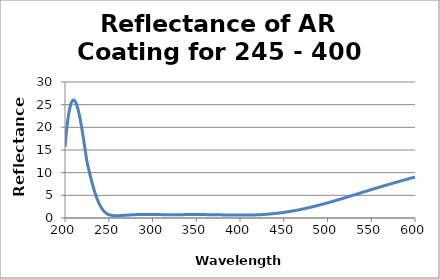
| Category | Reflectance (%) |
|---|---|
| 200.0 | 15.685 |
| 201.0 | 17.803 |
| 202.0 | 19.676 |
| 203.0 | 21.294 |
| 204.0 | 22.658 |
| 205.0 | 23.773 |
| 206.0 | 24.65 |
| 207.0 | 25.302 |
| 208.0 | 25.74 |
| 209.0 | 25.976 |
| 210.0 | 26.025 |
| 211.0 | 25.897 |
| 212.0 | 25.606 |
| 213.0 | 25.162 |
| 214.0 | 24.579 |
| 215.0 | 23.866 |
| 216.0 | 23.038 |
| 217.0 | 22.105 |
| 218.0 | 21.08 |
| 219.0 | 19.978 |
| 220.0 | 18.811 |
| 221.0 | 17.594 |
| 222.0 | 16.341 |
| 223.0 | 15.067 |
| 224.0 | 13.788 |
| 225.0 | 12.519 |
| 226.0 | 11.651 |
| 227.0 | 10.812 |
| 228.0 | 9.994 |
| 229.0 | 9.201 |
| 230.0 | 8.436 |
| 231.0 | 7.704 |
| 232.0 | 7.005 |
| 233.0 | 6.342 |
| 234.0 | 5.717 |
| 235.0 | 5.132 |
| 236.0 | 4.586 |
| 237.0 | 4.081 |
| 238.0 | 3.616 |
| 239.0 | 3.19 |
| 240.0 | 2.804 |
| 241.0 | 2.455 |
| 242.0 | 2.143 |
| 243.0 | 1.865 |
| 244.0 | 1.621 |
| 245.0 | 1.407 |
| 246.0 | 1.223 |
| 247.0 | 1.066 |
| 248.0 | 0.934 |
| 249.0 | 0.826 |
| 250.0 | 0.737 |
| 251.0 | 0.681 |
| 252.0 | 0.634 |
| 253.0 | 0.596 |
| 254.0 | 0.565 |
| 255.0 | 0.542 |
| 256.0 | 0.524 |
| 257.0 | 0.513 |
| 258.0 | 0.506 |
| 259.0 | 0.504 |
| 260.0 | 0.505 |
| 261.0 | 0.509 |
| 262.0 | 0.516 |
| 263.0 | 0.525 |
| 264.0 | 0.536 |
| 265.0 | 0.548 |
| 266.0 | 0.561 |
| 267.0 | 0.575 |
| 268.0 | 0.589 |
| 269.0 | 0.604 |
| 270.0 | 0.618 |
| 271.0 | 0.632 |
| 272.0 | 0.646 |
| 273.0 | 0.66 |
| 274.0 | 0.673 |
| 275.0 | 0.685 |
| 276.0 | 0.697 |
| 277.0 | 0.708 |
| 278.0 | 0.718 |
| 279.0 | 0.727 |
| 280.0 | 0.736 |
| 281.0 | 0.743 |
| 282.0 | 0.75 |
| 283.0 | 0.756 |
| 284.0 | 0.762 |
| 285.0 | 0.766 |
| 286.0 | 0.77 |
| 287.0 | 0.773 |
| 288.0 | 0.775 |
| 289.0 | 0.777 |
| 290.0 | 0.778 |
| 291.0 | 0.779 |
| 292.0 | 0.779 |
| 293.0 | 0.779 |
| 294.0 | 0.778 |
| 295.0 | 0.777 |
| 296.0 | 0.776 |
| 297.0 | 0.774 |
| 298.0 | 0.772 |
| 299.0 | 0.77 |
| 300.0 | 0.768 |
| 301.0 | 0.765 |
| 302.0 | 0.763 |
| 303.0 | 0.76 |
| 304.0 | 0.758 |
| 305.0 | 0.756 |
| 306.0 | 0.753 |
| 307.0 | 0.751 |
| 308.0 | 0.749 |
| 309.0 | 0.746 |
| 310.0 | 0.744 |
| 311.0 | 0.743 |
| 312.0 | 0.741 |
| 313.0 | 0.739 |
| 314.0 | 0.738 |
| 315.0 | 0.736 |
| 316.0 | 0.735 |
| 317.0 | 0.734 |
| 318.0 | 0.734 |
| 319.0 | 0.733 |
| 320.0 | 0.733 |
| 321.0 | 0.732 |
| 322.0 | 0.732 |
| 323.0 | 0.732 |
| 324.0 | 0.733 |
| 325.0 | 0.733 |
| 326.0 | 0.734 |
| 327.0 | 0.734 |
| 328.0 | 0.735 |
| 329.0 | 0.736 |
| 330.0 | 0.737 |
| 331.0 | 0.738 |
| 332.0 | 0.739 |
| 333.0 | 0.74 |
| 334.0 | 0.742 |
| 335.0 | 0.743 |
| 336.0 | 0.744 |
| 337.0 | 0.745 |
| 338.0 | 0.747 |
| 339.0 | 0.748 |
| 340.0 | 0.749 |
| 341.0 | 0.75 |
| 342.0 | 0.751 |
| 343.0 | 0.752 |
| 344.0 | 0.753 |
| 345.0 | 0.754 |
| 346.0 | 0.755 |
| 347.0 | 0.756 |
| 348.0 | 0.756 |
| 349.0 | 0.756 |
| 350.0 | 0.757 |
| 351.0 | 0.757 |
| 352.0 | 0.756 |
| 353.0 | 0.756 |
| 354.0 | 0.755 |
| 355.0 | 0.754 |
| 356.0 | 0.754 |
| 357.0 | 0.752 |
| 358.0 | 0.751 |
| 359.0 | 0.75 |
| 360.0 | 0.748 |
| 361.0 | 0.746 |
| 362.0 | 0.744 |
| 363.0 | 0.742 |
| 364.0 | 0.74 |
| 365.0 | 0.737 |
| 366.0 | 0.734 |
| 367.0 | 0.732 |
| 368.0 | 0.729 |
| 369.0 | 0.726 |
| 370.0 | 0.723 |
| 371.0 | 0.719 |
| 372.0 | 0.716 |
| 373.0 | 0.713 |
| 374.0 | 0.709 |
| 375.0 | 0.706 |
| 376.0 | 0.702 |
| 377.0 | 0.698 |
| 378.0 | 0.695 |
| 379.0 | 0.691 |
| 380.0 | 0.687 |
| 381.0 | 0.684 |
| 382.0 | 0.68 |
| 383.0 | 0.676 |
| 384.0 | 0.673 |
| 385.0 | 0.669 |
| 386.0 | 0.666 |
| 387.0 | 0.663 |
| 388.0 | 0.66 |
| 389.0 | 0.656 |
| 390.0 | 0.654 |
| 391.0 | 0.651 |
| 392.0 | 0.648 |
| 393.0 | 0.646 |
| 394.0 | 0.644 |
| 395.0 | 0.642 |
| 396.0 | 0.64 |
| 397.0 | 0.638 |
| 398.0 | 0.637 |
| 399.0 | 0.636 |
| 400.0 | 0.636 |
| 401.0 | 0.635 |
| 402.0 | 0.635 |
| 403.0 | 0.636 |
| 404.0 | 0.636 |
| 405.0 | 0.637 |
| 406.0 | 0.639 |
| 407.0 | 0.64 |
| 408.0 | 0.643 |
| 409.0 | 0.645 |
| 410.0 | 0.648 |
| 411.0 | 0.652 |
| 412.0 | 0.656 |
| 413.0 | 0.66 |
| 414.0 | 0.665 |
| 415.0 | 0.67 |
| 416.0 | 0.676 |
| 417.0 | 0.682 |
| 418.0 | 0.689 |
| 419.0 | 0.696 |
| 420.0 | 0.704 |
| 421.0 | 0.713 |
| 422.0 | 0.722 |
| 423.0 | 0.731 |
| 424.0 | 0.742 |
| 425.0 | 0.752 |
| 426.0 | 0.764 |
| 427.0 | 0.776 |
| 428.0 | 0.788 |
| 429.0 | 0.801 |
| 430.0 | 0.815 |
| 431.0 | 0.829 |
| 432.0 | 0.844 |
| 433.0 | 0.86 |
| 434.0 | 0.876 |
| 435.0 | 0.893 |
| 436.0 | 0.911 |
| 437.0 | 0.929 |
| 438.0 | 0.948 |
| 439.0 | 0.968 |
| 440.0 | 0.989 |
| 441.0 | 1.01 |
| 442.0 | 1.032 |
| 443.0 | 1.055 |
| 444.0 | 1.078 |
| 445.0 | 1.102 |
| 446.0 | 1.127 |
| 447.0 | 1.152 |
| 448.0 | 1.178 |
| 449.0 | 1.205 |
| 450.0 | 1.232 |
| 451.0 | 1.26 |
| 452.0 | 1.289 |
| 453.0 | 1.318 |
| 454.0 | 1.348 |
| 455.0 | 1.379 |
| 456.0 | 1.41 |
| 457.0 | 1.442 |
| 458.0 | 1.474 |
| 459.0 | 1.508 |
| 460.0 | 1.541 |
| 461.0 | 1.575 |
| 462.0 | 1.61 |
| 463.0 | 1.646 |
| 464.0 | 1.682 |
| 465.0 | 1.719 |
| 466.0 | 1.756 |
| 467.0 | 1.794 |
| 468.0 | 1.832 |
| 469.0 | 1.872 |
| 470.0 | 1.911 |
| 471.0 | 1.952 |
| 472.0 | 1.992 |
| 473.0 | 2.034 |
| 474.0 | 2.076 |
| 475.0 | 2.118 |
| 476.0 | 2.162 |
| 477.0 | 2.205 |
| 478.0 | 2.249 |
| 479.0 | 2.294 |
| 480.0 | 2.339 |
| 481.0 | 2.385 |
| 482.0 | 2.431 |
| 483.0 | 2.478 |
| 484.0 | 2.525 |
| 485.0 | 2.572 |
| 486.0 | 2.62 |
| 487.0 | 2.669 |
| 488.0 | 2.718 |
| 489.0 | 2.767 |
| 490.0 | 2.817 |
| 491.0 | 2.867 |
| 492.0 | 2.918 |
| 493.0 | 2.969 |
| 494.0 | 3.02 |
| 495.0 | 3.072 |
| 496.0 | 3.124 |
| 497.0 | 3.177 |
| 498.0 | 3.23 |
| 499.0 | 3.283 |
| 500.0 | 3.337 |
| 501.0 | 3.391 |
| 502.0 | 3.445 |
| 503.0 | 3.5 |
| 504.0 | 3.555 |
| 505.0 | 3.61 |
| 506.0 | 3.665 |
| 507.0 | 3.721 |
| 508.0 | 3.777 |
| 509.0 | 3.833 |
| 510.0 | 3.89 |
| 511.0 | 3.946 |
| 512.0 | 4.003 |
| 513.0 | 4.06 |
| 514.0 | 4.118 |
| 515.0 | 4.176 |
| 516.0 | 4.233 |
| 517.0 | 4.291 |
| 518.0 | 4.349 |
| 519.0 | 4.408 |
| 520.0 | 4.466 |
| 521.0 | 4.525 |
| 522.0 | 4.584 |
| 523.0 | 4.642 |
| 524.0 | 4.702 |
| 525.0 | 4.761 |
| 526.0 | 4.82 |
| 527.0 | 4.879 |
| 528.0 | 4.939 |
| 529.0 | 4.998 |
| 530.0 | 5.058 |
| 531.0 | 5.118 |
| 532.0 | 5.177 |
| 533.0 | 5.238 |
| 534.0 | 5.298 |
| 535.0 | 5.358 |
| 536.0 | 5.418 |
| 537.0 | 5.478 |
| 538.0 | 5.539 |
| 539.0 | 5.599 |
| 540.0 | 5.659 |
| 541.0 | 5.719 |
| 542.0 | 5.78 |
| 543.0 | 5.84 |
| 544.0 | 5.9 |
| 545.0 | 5.96 |
| 546.0 | 6.02 |
| 547.0 | 6.08 |
| 548.0 | 6.14 |
| 549.0 | 6.2 |
| 550.0 | 6.26 |
| 551.0 | 6.318 |
| 552.0 | 6.376 |
| 553.0 | 6.434 |
| 554.0 | 6.492 |
| 555.0 | 6.55 |
| 556.0 | 6.608 |
| 557.0 | 6.665 |
| 558.0 | 6.723 |
| 559.0 | 6.781 |
| 560.0 | 6.838 |
| 561.0 | 6.896 |
| 562.0 | 6.953 |
| 563.0 | 7.01 |
| 564.0 | 7.067 |
| 565.0 | 7.124 |
| 566.0 | 7.181 |
| 567.0 | 7.238 |
| 568.0 | 7.295 |
| 569.0 | 7.351 |
| 570.0 | 7.408 |
| 571.0 | 7.464 |
| 572.0 | 7.52 |
| 573.0 | 7.576 |
| 574.0 | 7.632 |
| 575.0 | 7.688 |
| 576.0 | 7.743 |
| 577.0 | 7.799 |
| 578.0 | 7.854 |
| 579.0 | 7.909 |
| 580.0 | 7.964 |
| 581.0 | 8.019 |
| 582.0 | 8.074 |
| 583.0 | 8.128 |
| 584.0 | 8.182 |
| 585.0 | 8.237 |
| 586.0 | 8.291 |
| 587.0 | 8.344 |
| 588.0 | 8.398 |
| 589.0 | 8.451 |
| 590.0 | 8.505 |
| 591.0 | 8.558 |
| 592.0 | 8.61 |
| 593.0 | 8.663 |
| 594.0 | 8.716 |
| 595.0 | 8.768 |
| 596.0 | 8.82 |
| 597.0 | 8.872 |
| 598.0 | 8.924 |
| 599.0 | 8.975 |
| 600.0 | 9.026 |